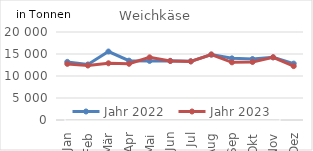
| Category | Jahr 2022 | Jahr 2023 |
|---|---|---|
| Jan | 13210.712 | 12753.856 |
| Feb | 12617.794 | 12383.343 |
| Mär | 15562.046 | 12891.612 |
| Apr | 13488.659 | 12776.44 |
| Mai | 13426.012 | 14240.391 |
| Jun | 13447.547 | 13414.143 |
| Jul | 13340.485 | 13318.065 |
| Aug | 14861.396 | 14887.57 |
| Sep | 14012.122 | 13104.837 |
| Okt | 13853.218 | 13185 |
| Nov | 14235.076 | 14259.402 |
| Dez | 12819.596 | 12239.838 |